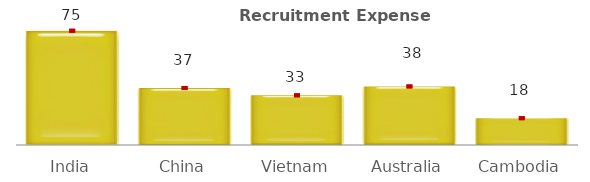
| Category | Series 0 |
|---|---|
| India | 74.925 |
| China | 37.411 |
| Vietnam | 32.586 |
| Australia | 38.397 |
| Cambodia | 17.571 |